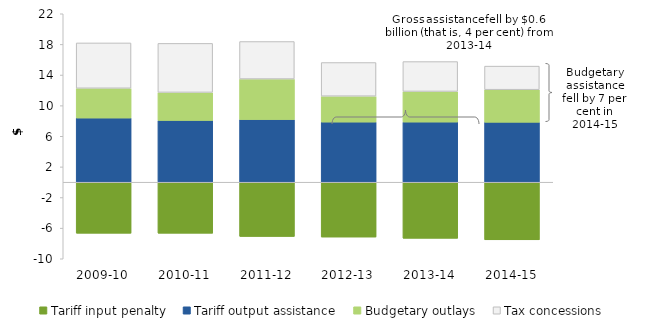
| Category | Tariff input penalty | Tariff output assistance | Budgetary outlays | Tax concessions |
|---|---|---|---|---|
| 2009-10 | -6.665 | 8.382 | 3.887 | 5.921 |
| 2010-11 | -6.664 | 8.071 | 3.657 | 6.401 |
| 2011-12 | -7.078 | 8.181 | 5.293 | 4.9 |
| 2012-13 | -7.167 | 7.848 | 3.387 | 4.396 |
| 2013-14 | -7.329 | 7.853 | 4.002 | 3.901 |
| 2014-15 | -7.525 | 7.827 | 4.256 | 3.08 |